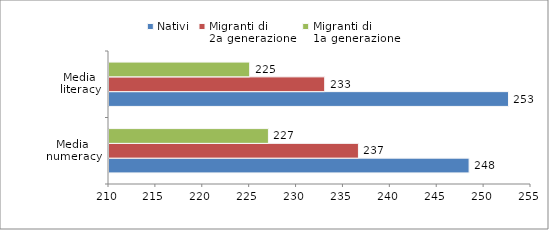
| Category | Nativi | Migranti di 
2a generazione | Migranti di 
1a generazione |
|---|---|---|---|
| Media numeracy | 248.4 | 236.6 | 227 |
| Media literacy | 252.6 | 233 | 225 |